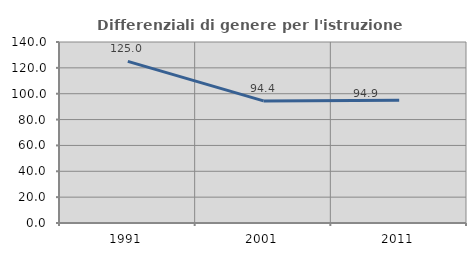
| Category | Differenziali di genere per l'istruzione superiore |
|---|---|
| 1991.0 | 124.997 |
| 2001.0 | 94.425 |
| 2011.0 | 94.931 |